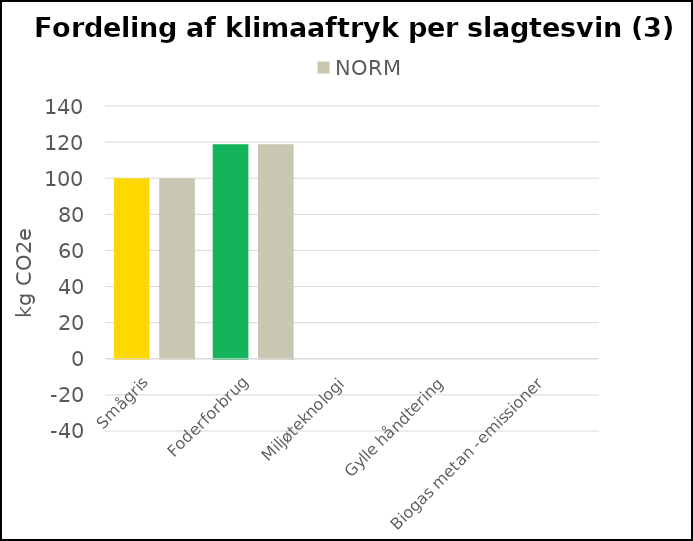
| Category | Smågris | NORM |
|---|---|---|
| Smågris | 99.988 | 100 |
| Foderforbrug | 118.874 | 118.874 |
| Miljøteknologi | 0 | 0 |
| Gylle håndtering | 0 | 0 |
| Biogas metan -emissioner | 0 | 0 |